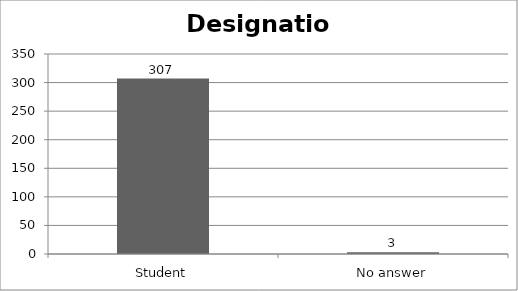
| Category | Designation |
|---|---|
| Student | 307 |
| No answer | 3 |